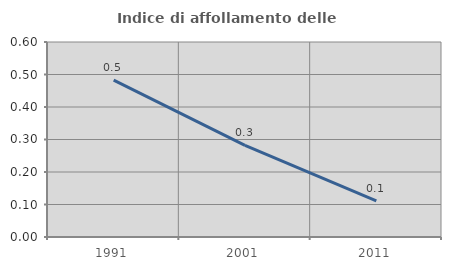
| Category | Indice di affollamento delle abitazioni  |
|---|---|
| 1991.0 | 0.483 |
| 2001.0 | 0.282 |
| 2011.0 | 0.111 |